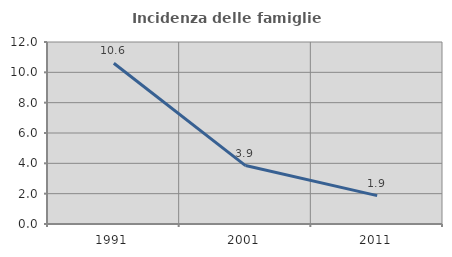
| Category | Incidenza delle famiglie numerose |
|---|---|
| 1991.0 | 10.596 |
| 2001.0 | 3.853 |
| 2011.0 | 1.872 |